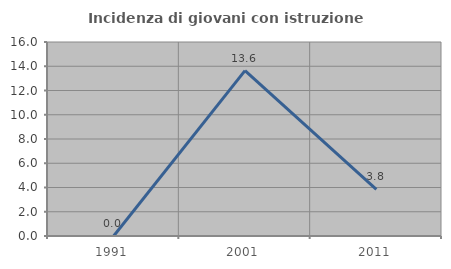
| Category | Incidenza di giovani con istruzione universitaria |
|---|---|
| 1991.0 | 0 |
| 2001.0 | 13.636 |
| 2011.0 | 3.846 |